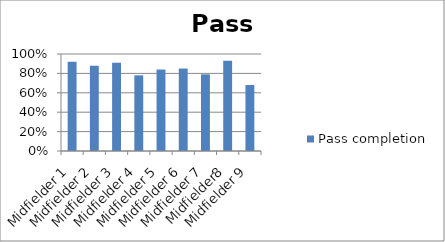
| Category | Pass completion |
|---|---|
| Midfielder 1 | 0.92 |
| Midfielder 2 | 0.88 |
| Midfielder 3 | 0.91 |
| Midfielder 4 | 0.78 |
| Midfielder 5 | 0.84 |
| Midfielder 6 | 0.85 |
| Midfielder 7 | 0.79 |
| Midfielder8 | 0.93 |
| Midfielder 9 | 0.68 |